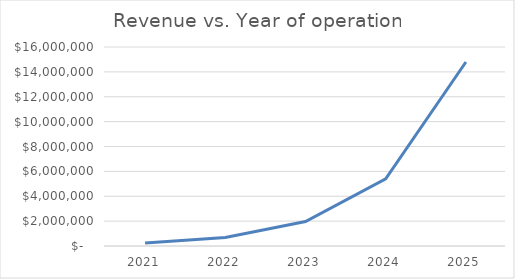
| Category | Series 0 |
|---|---|
| 2021.0 | 250000 |
| 2022.0 | 689000 |
| 2023.0 | 1966300 |
| 2024.0 | 5396791.25 |
| 2025.0 | 14794651.875 |